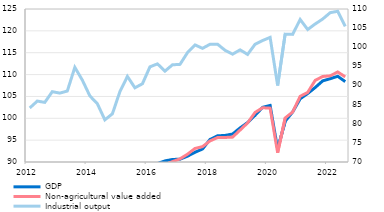
| Category | GDP | Non-agricultural value added |
|---|---|---|
| 2012 | 84.018 | 84.612 |
| II | 85.258 | 85.96 |
| III | 84.302 | 84.992 |
| IV | 84.116 | 85.358 |
| 2013 | 86.02 | 86.217 |
| II | 86.175 | 86.066 |
| III | 87.892 | 88.326 |
| IV | 87.218 | 87.438 |
| 2014 | 86.152 | 85.98 |
| II | 85.484 | 85.23 |
| III | 84.559 | 84.096 |
| IV | 85.868 | 85.308 |
| 2015 | 86.262 | 86.126 |
| II | 87.023 | 87.171 |
| III | 86.897 | 87.198 |
| IV | 87.886 | 88.099 |
| 2016 | 89.166 | 88.801 |
| II | 89.646 | 89.152 |
| III | 90.249 | 89.415 |
| IV | 90.577 | 90.087 |
| 2017 | 90.641 | 90.715 |
| II | 91.332 | 91.781 |
| III | 92.227 | 93.099 |
| IV | 92.975 | 93.517 |
| 2018 | 95.156 | 94.822 |
| II | 95.991 | 95.589 |
| III | 96.075 | 95.614 |
| IV | 96.399 | 95.689 |
| 2019 | 97.791 | 97.306 |
| II | 99.022 | 98.94 |
| III | 100.682 | 101.344 |
| IV | 102.505 | 102.41 |
| 2020 | 102.935 | 102.319 |
| II | 92.928 | 92.115 |
| III | 99.313 | 100.067 |
| IV | 101.448 | 101.436 |
| 2021 | 104.465 | 105.028 |
| II | 105.666 | 105.913 |
| III | 107.038 | 108.676 |
| IV | 108.563 | 109.568 |
| 2022 | 109.057 | 109.723 |
| II | 109.608 | 110.591 |
| III | 108.382 | 109.482 |